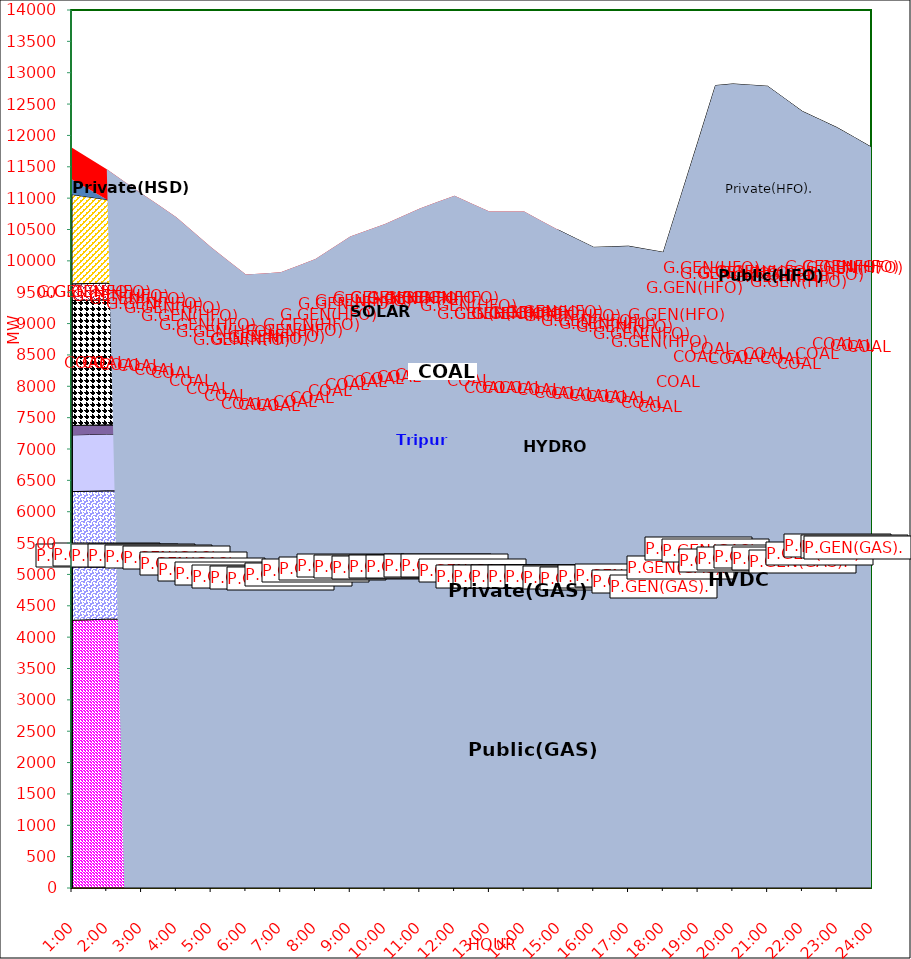
| Category | GAS | P.GEN(GAS). |  HVDC | TRIPURA | HYDRO | COAL | SOLAR | G.GEN(HFO) | P.GEN(HFO). | G.GEN(HSD) | P.GEN(HSD) | SHORTAGE | Total Energy Gen 260.823 MKWHr 
Energy Not Served   4.201 MKWHr 
Energy Requirement     265.023 MKWHr  |
|---|---|---|---|---|---|---|---|---|---|---|---|---|---|
| 1:00 | 4268 | 2053 | 904 | 150 | 0 | 1992 | 0 | 266 | 1424 | 0 | 241 | 504.24 |  |
| 1:30 | 4277.5 | 2049.5 | 904 | 149 | 0 | 1992.5 | 0 | 266 | 1379 | 0 | 120.5 | 493.257 |  |
| 2:00 | 4287 | 2046 | 904 | 148 | 0 | 1993 | 0 | 266 | 1334 | 0 | 0 | 482.275 |  |
| 2:30 | 4285 | 2046.5 | 904 | 148 | 0 | 1940 | 0 | 258 | 1221.5 | 0 | 0 | 464.13 |  |
| 3:00 | 4283 | 2047 | 904 | 148 | 0 | 1887 | 0 | 250 | 1109 | 0 | 0 | 445.985 |  |
| 3:30 | 4284.5 | 2006 | 903.5 | 145 | 0 | 1863 | 0 | 250 | 1005 | 0 | 0 | 427.84 |  |
| 4:00 | 4286 | 1965 | 903 | 142 | 0 | 1839 | 0 | 250 | 901 | 0 | 0 | 409.695 |  |
| 4:30 | 4215.5 | 1917.5 | 903.5 | 140 | 0 | 1824.5 | 0 | 250 | 832.5 | 0 | 0 | 371.972 |  |
| 5:00 | 4145 | 1870 | 904 | 138 | 0 | 1810 | 0 | 250 | 764 | 0 | 0 | 334.25 |  |
| 5:30 | 4123 | 1797 | 904 | 130 | 0 | 1784.5 | 9 | 246 | 717.5 | 0 | 0 | 287.933 |  |
| 6:00 | 4101 | 1724 | 904 | 122 | 0 | 1759 | 18 | 242 | 671 | 0 | 0 | 241.615 |  |
| 6:30 | 4086.5 | 1721 | 904 | 122 | 0 | 1760 | 55.5 | 241.5 | 662.5 | 0 | 0 | 247.345 |  |
| 7:00 | 4072 | 1718 | 904 | 122 | 0 | 1761 | 93 | 241 | 654 | 0 | 0 | 253.075 |  |
| 7:30 | 4142.5 | 1701.5 | 904 | 128 | 0 | 1766 | 126 | 241 | 666.5 | 0 | 0 | 247.822 |  |
| 8:00 | 4213 | 1685 | 904 | 134 | 0 | 1771 | 159 | 241 | 679 | 0 | 0 | 242.57 |  |
| 8:30 | 4202.5 | 1785.5 | 903.5 | 136 | 0 | 1795 | 208.5 | 241 | 691.5 | 0 | 0 | 244.957 |  |
| 9:00 | 4192 | 1886 | 903 | 138 | 0 | 1819 | 258 | 241 | 704 | 0 | 0 | 247.345 |  |
| 9:30 | 4137 | 1975.5 | 903.5 | 146 | 12.5 | 1808 | 263 | 249 | 743 | 0 | 0 | 250.688 |  |
| 10:00 | 4082 | 2065 | 904 | 154 | 25 | 1797 | 268 | 257 | 782 | 0 | 0 | 254.03 |  |
| 10:30 | 4087 | 2074 | 904 | 156 | 25 | 1817.5 | 223.5 | 256.5 | 901.5 | 0 | 0 | 267.4 |  |
| 11:00 | 4092 | 2083 | 904 | 158 | 25 | 1838 | 179 | 256 | 1021 | 0 | 0 | 280.77 |  |
| 11:30 | 4097 | 2082 | 904.5 | 161 | 25 | 1848 | 160.5 | 264 | 1126 | 0 | 0 | 269.31 |  |
| 12:00 | 4102 | 2081 | 905 | 164 | 25 | 1858 | 142 | 272 | 1231 | 0 | 0 | 257.85 |  |
| 12:30 | 4038 | 2035.5 | 904 | 167 | 25 | 1844 | 131 | 277.5 | 1256 | 0 | 0 | 234.425 |  |
| 13:00 | 3974 | 1990 | 903 | 170 | 25 | 1830 | 120 | 283 | 1281 | 0 | 0 | 211 |  |
| 13:30 | 3974 | 1990 | 903 | 170 | 25 | 1830 | 120 | 283 | 1281 | 0 | 0 | 211 |  |
| 14:00 | 3974 | 1990 | 903 | 170 | 25 | 1830 | 120 | 283 | 1281 | 0 | 0 | 211 |  |
| 14:30 | 3960.5 | 2009 | 903 | 130 | 25 | 1829 | 174 | 282 | 1219 | 0 | 0 | 105.5 |  |
| 15:00 | 3947 | 2028 | 903 | 90 | 25 | 1828 | 228 | 281 | 1157 | 0 | 0 | 0 |  |
| 15:30 | 3959.5 | 1983 | 903.5 | 102 | 25 | 1813 | 203 | 265.5 | 1096.5 | 0 | 0 | 0 |  |
| 16:00 | 3972 | 1938 | 904 | 114 | 25 | 1798 | 178 | 250 | 1036 | 0 | 0 | 0 |  |
| 16:30 | 4029.5 | 1864.5 | 903.5 | 117 | 25 | 1797.5 | 139.5 | 257.5 | 1090.5 | 0 | 0 | 0 |  |
| 17:00 | 4087 | 1791 | 903 | 120 | 25 | 1797 | 101 | 265 | 1145 | 0 | 0 | 0 |  |
| 17:30 | 3973 | 1837.5 | 903.5 | 120 | 25 | 1777 | 64.5 | 274.5 | 1210 | 0 | 0 | 0 |  |
| 18:00 | 3859 | 1884 | 904 | 120 | 25 | 1757 | 28 | 284 | 1275 | 0 | 0 | 0 |  |
| 18:30 | 4084.5 | 2041 | 904 | 132 | 25 | 1769.5 | 14 | 346.5 | 1704 | 0 | 0 | 0 |  |
| 19:00 | 4310 | 2198 | 904 | 144 | 25 | 1782 | 0 | 409 | 2133 | 0 | 0 | 0 |  |
| 19:30 | 4238 | 2289 | 904 | 148 | 25 | 1988 | 0 | 600 | 2603 | 0 | 0 | 0 |  |
| 20:00 | 4103 | 2237 | 904 | 144 | 25 | 2065 | 0 | 636 | 2707 | 0 | 0 | 0 |  |
| 20:30 | 4139 | 2232.5 | 904 | 137 | 25 | 2089.5 | 0 | 570 | 2705.5 | 0 | 0 | 0 |  |
| 21:00 | 4175 | 2228 | 904 | 130 | 25 | 2114 | 0 | 504 | 2704 | 0 | 0 | 0 |  |
| 21:30 | 4136 | 2224.5 | 867.5 | 135 | 25 | 2114 | 0 | 498 | 2583.5 | 0 | 0 | 0 |  |
| 22:00 | 4097 | 2221 | 831 | 140 | 25 | 2114 | 0 | 492 | 2463 | 0 | 0 | 0 |  |
| 22:30 | 4193 | 2285.5 | 833.5 | 140 | 12.5 | 2118 | 0 | 414.5 | 2256.5 | 0 | 0 | 0 |  |
| 23:00 | 4289 | 2350 | 836 | 140 | 0 | 2122 | 0 | 337 | 2050 | 0 | 0 | 0 |  |
| 23:30 | 4280 | 2326 | 837.5 | 140 | 0 | 2137.5 | 0 | 363 | 1882 | 0 | 0 | 0 |  |
| 24:00 | 4271 | 2302 | 839 | 140 | 0 | 2153 | 0 | 389 | 1714 | 0 | 0 | 0 |  |